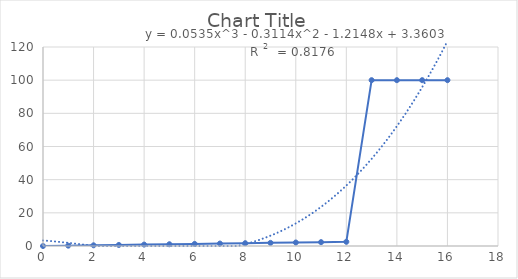
| Category | Series 0 |
|---|---|
| 0.0 | 0 |
| 1.0 | 0.211 |
| 2.0 | 0.422 |
| 3.0 | 0.632 |
| 4.0 | 0.843 |
| 5.0 | 1.054 |
| 6.0 | 1.265 |
| 7.0 | 1.476 |
| 8.0 | 1.687 |
| 9.0 | 1.897 |
| 10.0 | 2.108 |
| 11.0 | 2.319 |
| 12.0 | 2.53 |
| 13.0 | 100 |
| 14.0 | 100 |
| 15.0 | 100 |
| 16.0 | 100 |